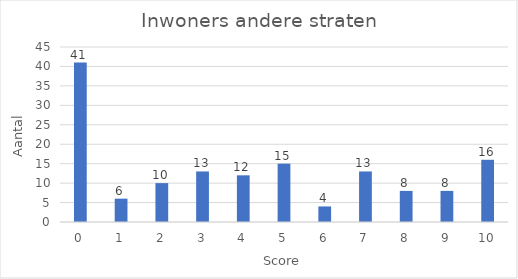
| Category | Aantal |
|---|---|
| 0.0 | 41 |
| 1.0 | 6 |
| 2.0 | 10 |
| 3.0 | 13 |
| 4.0 | 12 |
| 5.0 | 15 |
| 6.0 | 4 |
| 7.0 | 13 |
| 8.0 | 8 |
| 9.0 | 8 |
| 10.0 | 16 |